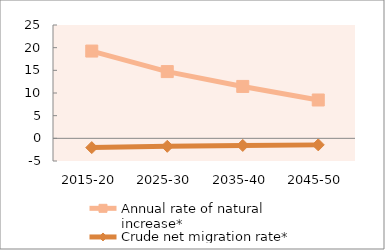
| Category | Annual rate of natural increase* | Crude net migration rate* |
|---|---|---|
| 2015-20 | 19.253 | -2.045 |
| 2025-30 | 14.725 | -1.759 |
| 2035-40 | 11.451 | -1.57 |
| 2045-50 | 8.457 | -1.443 |